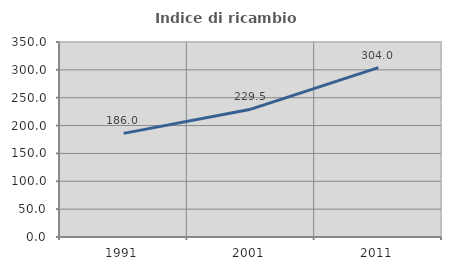
| Category | Indice di ricambio occupazionale  |
|---|---|
| 1991.0 | 185.978 |
| 2001.0 | 229.457 |
| 2011.0 | 304.049 |